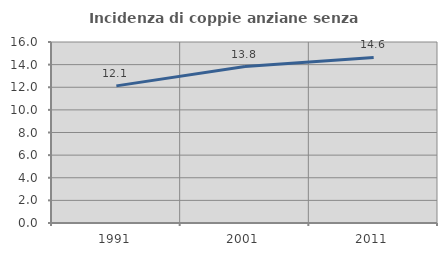
| Category | Incidenza di coppie anziane senza figli  |
|---|---|
| 1991.0 | 12.121 |
| 2001.0 | 13.828 |
| 2011.0 | 14.634 |